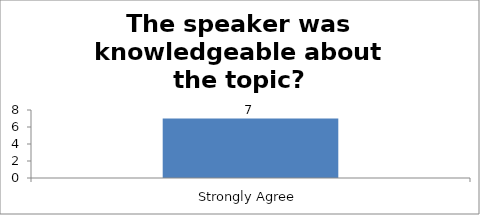
| Category | The speaker was knowledgeable about the topic? |
|---|---|
| Strongly Agree | 7 |